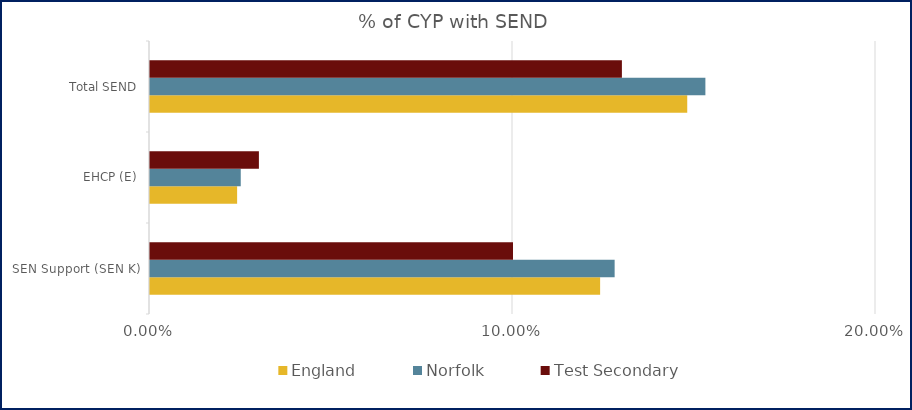
| Category | England | Norfolk | Test Secondary |
|---|---|---|---|
| SEN Support (SEN K) | 0.124 | 0.128 | 0.1 |
| EHCP (E) | 0.024 | 0.025 | 0.03 |
| Total SEND | 0.148 | 0.153 | 0.13 |